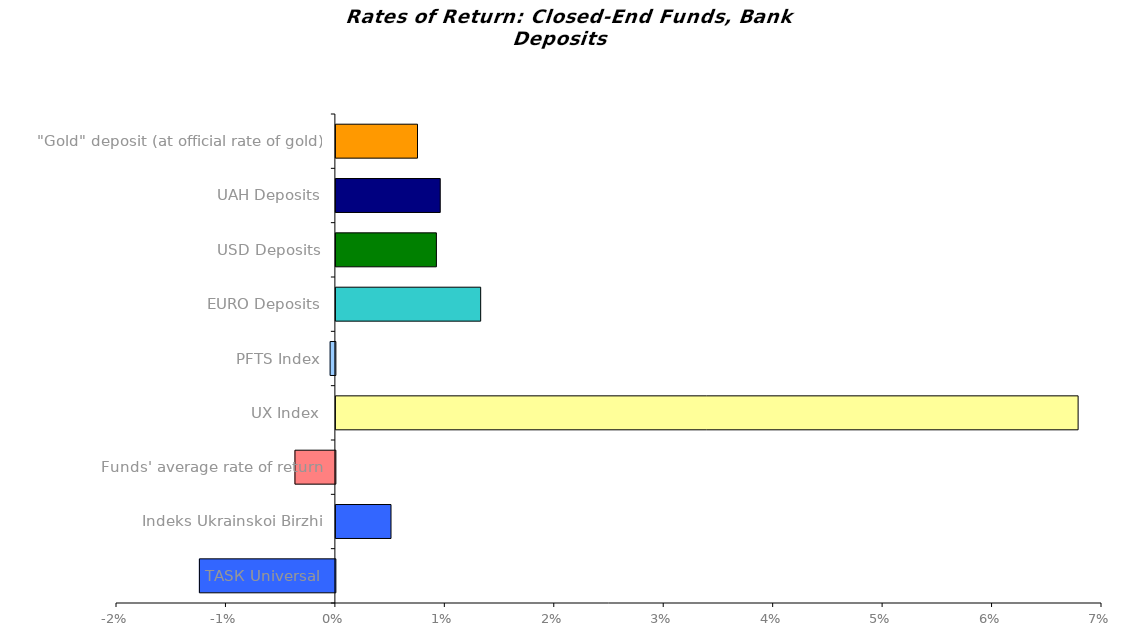
| Category | Series 0 |
|---|---|
| ТАSК Universal | -0.012 |
| Іndeks Ukrainskoi Birzhi | 0.005 |
| Funds' average rate of return | -0.004 |
| UX Index | 0.068 |
| PFTS Index | 0 |
| EURO Deposits | 0.013 |
| USD Deposits | 0.009 |
| UAH Deposits | 0.01 |
| "Gold" deposit (at official rate of gold) | 0.007 |